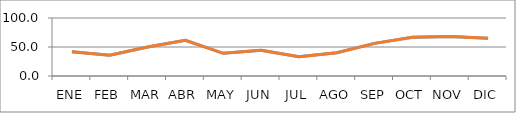
| Category | Porcentaje de gestantes con atención prenatal reenfocada | Series 1 |
|---|---|---|
| ENE | 41.667 |  |
| FEB | 35.714 |  |
| MAR | 50 |  |
| ABR | 61.538 |  |
| MAY | 39.13 |  |
| JUN | 44.444 |  |
| JUL | 33.333 |  |
| AGO | 40 |  |
| SEP | 56.25 |  |
| OCT | 66.667 |  |
| NOV | 68.182 |  |
| DIC | 65.217 |  |